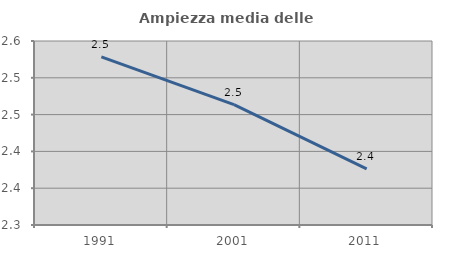
| Category | Ampiezza media delle famiglie |
|---|---|
| 1991.0 | 2.529 |
| 2001.0 | 2.464 |
| 2011.0 | 2.376 |